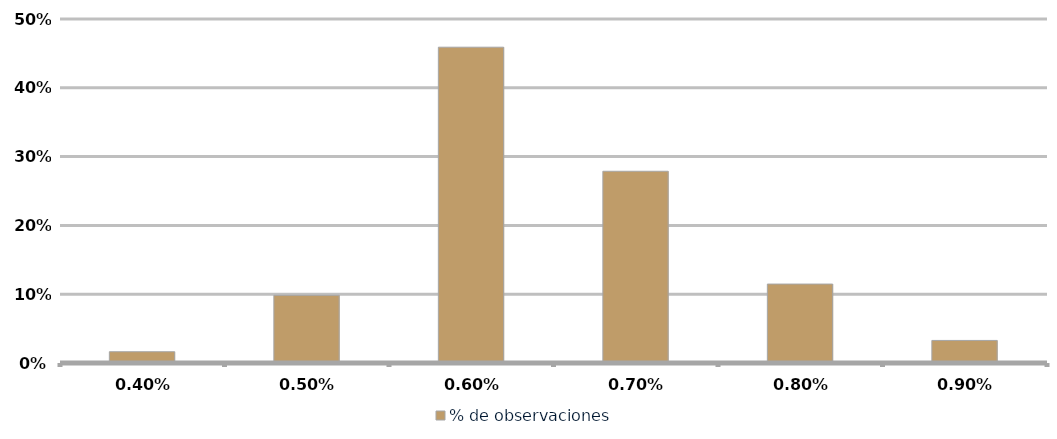
| Category | % de observaciones  |
|---|---|
| 0.004 | 0.016 |
| 0.005 | 0.098 |
| 0.006 | 0.459 |
| 0.007 | 0.279 |
| 0.008 | 0.115 |
| 0.009000000000000001 | 0.033 |